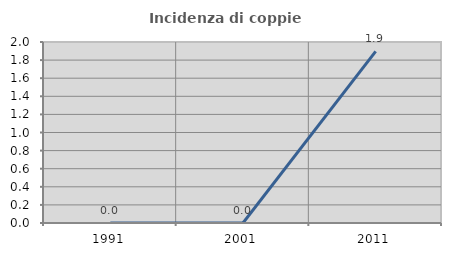
| Category | Incidenza di coppie miste |
|---|---|
| 1991.0 | 0 |
| 2001.0 | 0 |
| 2011.0 | 1.896 |